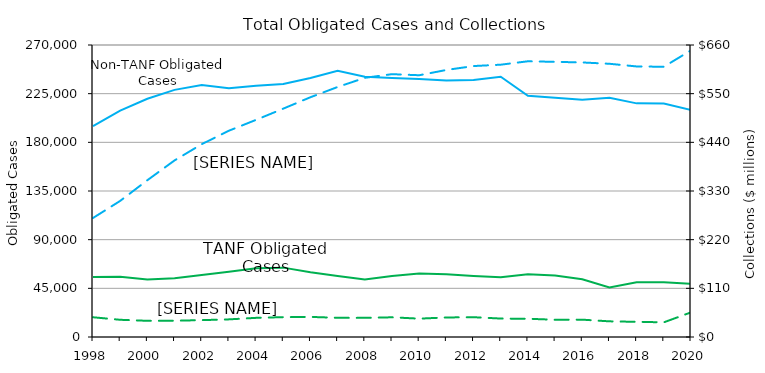
| Category | Series 2 | Non-TANF Obligated Cases |
|---|---|---|
| 1998.0 | 55456 | 195061 |
| 1999.0 | 55661 | 209350 |
| 2000.0 | 53103 | 220282 |
| 2001.0 | 54399 | 228497 |
| 2002.0 | 57374 | 232976 |
| 2003.0 | 60290 | 230041 |
| 2004.0 | 63509 | 232296 |
| 2005.0 | 64135 | 233996 |
| 2006.0 | 59798 | 239509 |
| 2007.0 | 56481 | 246073 |
| 2008.0 | 53227 | 240651 |
| 2009.0 | 56446 | 239401 |
| 2010.0 | 58813 | 238567 |
| 2011.0 | 58015 | 237124 |
| 2012.0 | 56413 | 237669 |
| 2013.0 | 55154 | 240606 |
| 2014.0 | 58089 | 223048 |
| 2015.0 | 56763 | 221134 |
| 2016.0 | 53308 | 219343 |
| 2017.0 | 45821 | 221300 |
| 2018.0 | 50546 | 216029 |
| 2019.0 | 50524.039 | 215952.961 |
| 2020.0 | 49129.91 | 209994.09 |